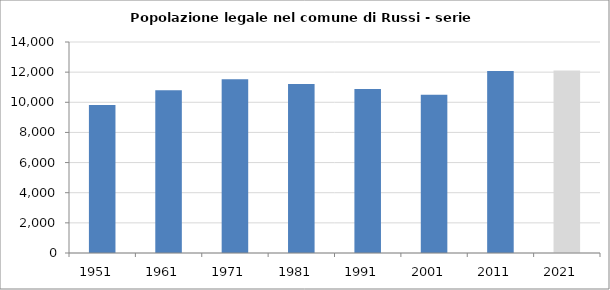
| Category | Popolazione residente |
|---|---|
| 1951   | 9814 |
| 1961   | 10792 |
| 1971   | 11526 |
| 1981   | 11215 |
| 1991   | 10879 |
| 2001   | 10503 |
| 2011   | 12083 |
| 2021   | 12107 |